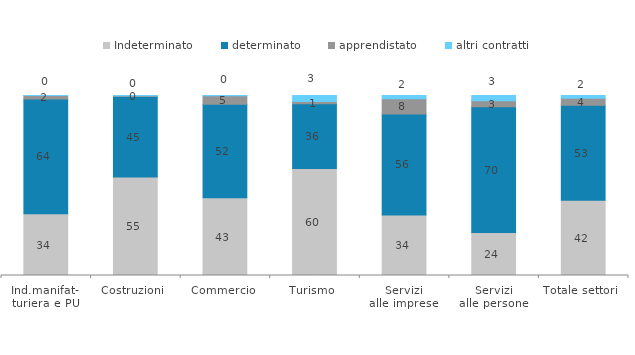
| Category | Indeterminato | determinato | apprendistato | altri contratti |
|---|---|---|---|---|
| Ind.manifat-
turiera e PU | 34.335 | 63.757 | 1.85 | 0.058 |
| Costruzioni | 54.761 | 44.732 | 0.338 | 0.169 |
| Commercio | 43.146 | 52.048 | 4.697 | 0.109 |
| Turismo | 59.513 | 35.968 | 1.137 | 3.383 |
| Servizi
alle imprese | 33.576 | 56.203 | 8.347 | 1.873 |
| Servizi
alle persone | 23.948 | 69.742 | 3.324 | 2.985 |
| Totale settori | 41.757 | 52.879 | 3.803 | 1.561 |